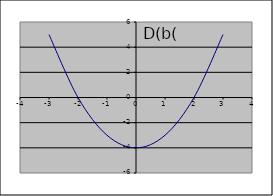
| Category | Series 0 |
|---|---|
| -3.0 | 5 |
| -2.0 | 0 |
| -1.0 | -3 |
| 0.0 | -4 |
| 1.0 | -3 |
| 2.0 | 0 |
| 3.0 | 5 |